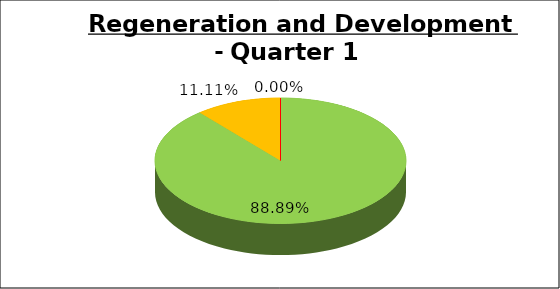
| Category | Q1 |
|---|---|
| Green | 0.889 |
| Amber | 0.111 |
| Red | 0 |